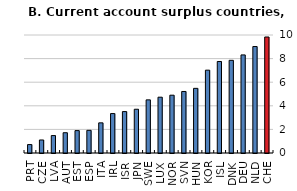
| Category | Updated |
|---|---|
| PRT | 0.714 |
| CZE | 1.103 |
| LVA | 1.477 |
| AUT | 1.718 |
| EST | 1.898 |
| ESP | 1.921 |
| ITA | 2.555 |
| IRL | 3.342 |
| ISR | 3.51 |
| JPN | 3.708 |
| SWE | 4.503 |
| LUX | 4.73 |
| NOR | 4.899 |
| SVN | 5.214 |
| HUN | 5.479 |
| KOR | 7.019 |
| ISL | 7.754 |
| DNK | 7.854 |
| DEU | 8.312 |
| NLD | 9.022 |
| CHE | 9.831 |